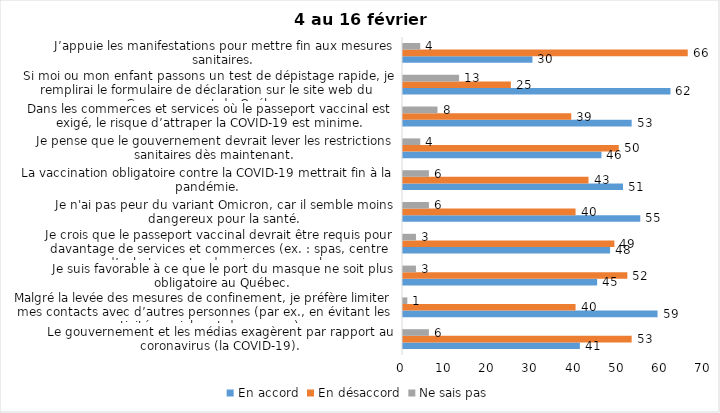
| Category | En accord | En désaccord | Ne sais pas |
|---|---|---|---|
| Le gouvernement et les médias exagèrent par rapport au coronavirus (la COVID-19). | 41 | 53 | 6 |
| Malgré la levée des mesures de confinement, je préfère limiter mes contacts avec d’autres personnes (par ex., en évitant les activités sociales et de groupes) | 59 | 40 | 1 |
| Je suis favorable à ce que le port du masque ne soit plus obligatoire au Québec. | 45 | 52 | 3 |
| Je crois que le passeport vaccinal devrait être requis pour davantage de services et commerces (ex. : spas, centre d’achats, centre de soins personnels. | 48 | 49 | 3 |
| Je n'ai pas peur du variant Omicron, car il semble moins dangereux pour la santé. | 55 | 40 | 6 |
| La vaccination obligatoire contre la COVID-19 mettrait fin à la pandémie. | 51 | 43 | 6 |
| Je pense que le gouvernement devrait lever les restrictions sanitaires dès maintenant. | 46 | 50 | 4 |
| Dans les commerces et services où le passeport vaccinal est exigé, le risque d’attraper la COVID-19 est minime. | 53 | 39 | 8 |
| Si moi ou mon enfant passons un test de dépistage rapide, je remplirai le formulaire de déclaration sur le site web du Gouvernement du Québec. | 62 | 25 | 13 |
| J’appuie les manifestations pour mettre fin aux mesures sanitaires. | 30 | 66 | 4 |